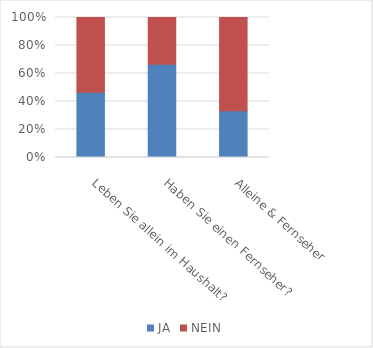
| Category | JA | NEIN |
|---|---|---|
| Leben Sie allein im Haushalt? | 7 | 8 |
| Haben Sie einen Fernseher? | 10 | 5 |
| Alleine & Fernseher | 5 | 10 |